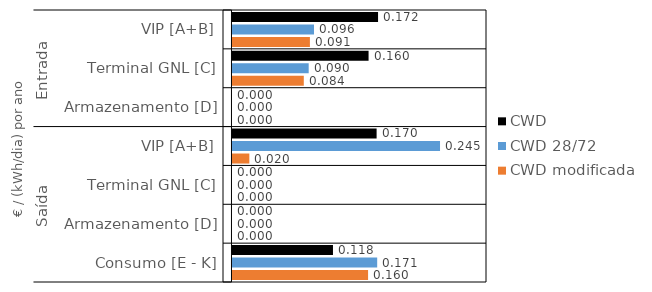
| Category | CWD | CWD 28/72 | CWD modificada |
|---|---|---|---|
| 0 | 0.172 | 0.096 | 0.091 |
| 1 | 0.16 | 0.09 | 0.084 |
| 2 | 0 | 0 | 0 |
| 3 | 0.17 | 0.245 | 0.02 |
| 4 | 0 | 0 | 0 |
| 5 | 0 | 0 | 0 |
| 6 | 0.118 | 0.171 | 0.16 |